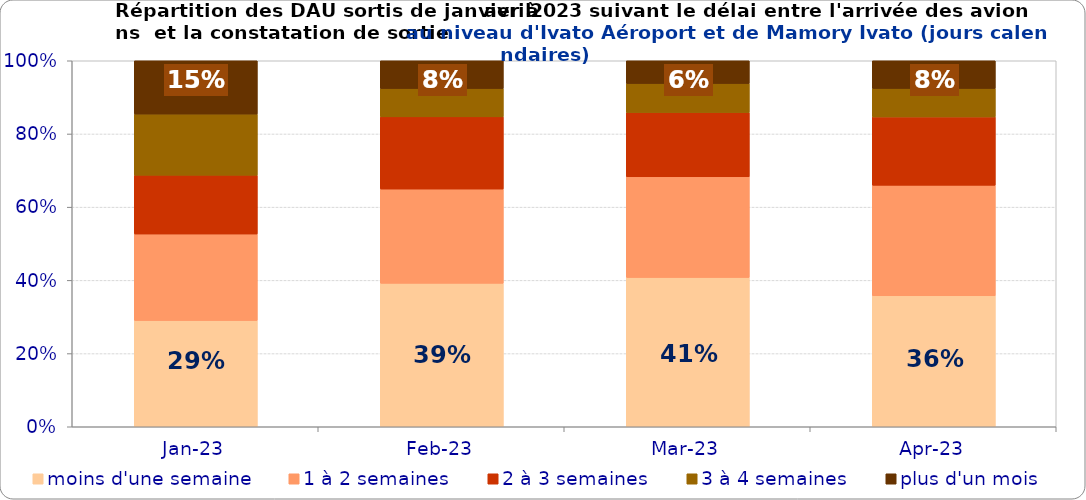
| Category | moins d'une semaine | 1 à 2 semaines | 2 à 3 semaines | 3 à 4 semaines | plus d'un mois |
|---|---|---|---|---|---|
| 2023-01-01 | 0.29 | 0.236 | 0.161 | 0.167 | 0.146 |
| 2023-02-01 | 0.392 | 0.258 | 0.197 | 0.077 | 0.076 |
| 2023-03-01 | 0.408 | 0.275 | 0.176 | 0.079 | 0.062 |
| 2023-04-01 | 0.358 | 0.302 | 0.187 | 0.078 | 0.076 |